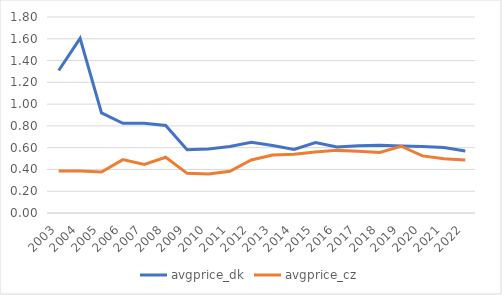
| Category | avgprice_dk | avgprice_cz |
|---|---|---|
| 2003.0 | 1.309 | 0.386 |
| 2004.0 | 1.604 | 0.386 |
| 2005.0 | 0.92 | 0.377 |
| 2006.0 | 0.824 | 0.49 |
| 2007.0 | 0.824 | 0.446 |
| 2008.0 | 0.803 | 0.512 |
| 2009.0 | 0.582 | 0.364 |
| 2010.0 | 0.588 | 0.357 |
| 2011.0 | 0.61 | 0.384 |
| 2012.0 | 0.65 | 0.487 |
| 2013.0 | 0.62 | 0.533 |
| 2014.0 | 0.584 | 0.54 |
| 2015.0 | 0.647 | 0.561 |
| 2016.0 | 0.607 | 0.575 |
| 2017.0 | 0.619 | 0.568 |
| 2018.0 | 0.623 | 0.556 |
| 2019.0 | 0.615 | 0.613 |
| 2020.0 | 0.611 | 0.524 |
| 2021.0 | 0.601 | 0.498 |
| 2022.0 | 0.569 | 0.487 |